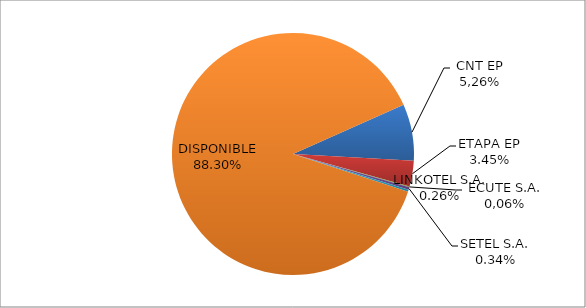
| Category | CODIGO DE AREA 7 |
|---|---|
| CORPORACIÓN NACIONAL TELECOMUNICACIONES CNT EP | 0.076 |
| ETAPA EP | 0.035 |
| CONECEL (ex ECUADORTELECOM S.A.) | 0.001 |
| SETEL S.A. | 0.003 |
| LINKOTEL S.A. | 0.003 |
| DISPONIBLE | 0.883 |